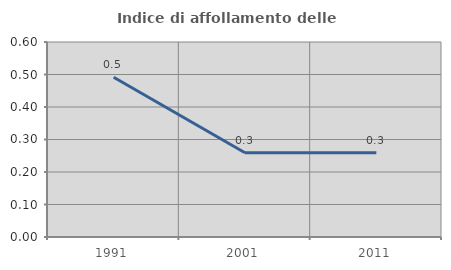
| Category | Indice di affollamento delle abitazioni  |
|---|---|
| 1991.0 | 0.491 |
| 2001.0 | 0.259 |
| 2011.0 | 0.259 |